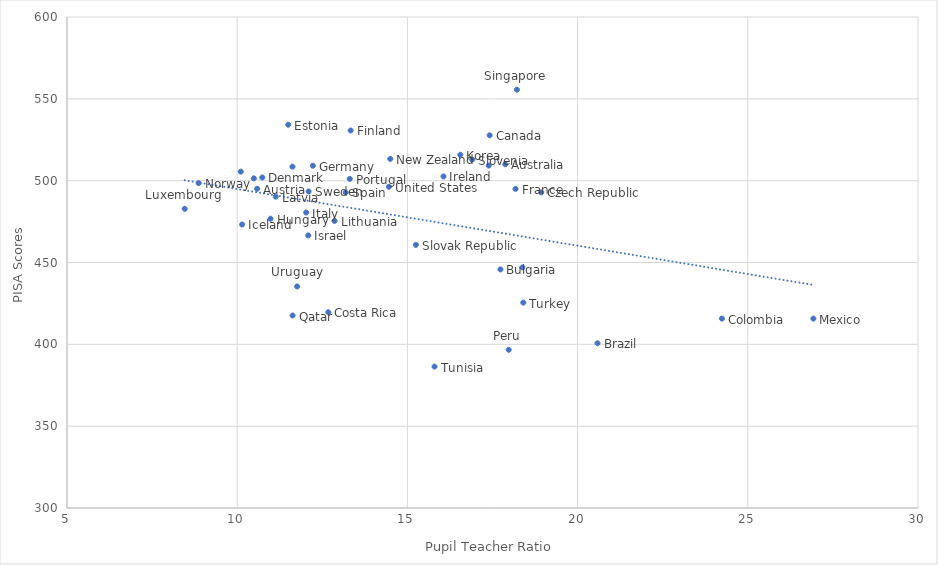
| Category | Series 0 |
|---|---|
| 17.87578 | 509.994 |
| 10.58415 | 495.037 |
| 20.58529 | 400.682 |
| 17.73363 | 445.772 |
| 17.41596 | 527.705 |
| 18.3778 | 446.956 |
| 24.23937 | 415.729 |
| 12.6763 | 419.608 |
| 18.93175 | 492.83 |
| 10.73738 | 501.937 |
| 11.49954 | 534.194 |
| 13.33204 | 530.661 |
| 18.1766 | 494.978 |
| 12.22305 | 509.141 |
| 10.97863 | 476.748 |
| 10.14405 | 473.23 |
| 16.06046 | 502.575 |
| 12.08838 | 466.553 |
| 12.02716 | 480.547 |
| 16.55424 | 515.81 |
| 11.13249 | 490.225 |
| 12.86014 | 475.409 |
| 8.45773 | 482.806 |
| 26.92701 | 415.71 |
| 11.62356 | 508.575 |
| 14.49628 | 513.304 |
| 8.86857 | 498.481 |
| 17.9767 | 396.684 |
| 10.49058 | 501.435 |
| 13.30619 | 501.1 |
| 11.62677 | 417.611 |
| 18.21792 | 555.575 |
| 15.24933 | 460.775 |
| 16.90462 | 512.864 |
| 13.18623 | 492.786 |
| 12.09754 | 493.422 |
| 10.10462 | 505.506 |
| 15.79669 | 386.403 |
| 18.40513 | 425.49 |
| 17.3882 | 509.222 |
| 14.45723 | 496.242 |
| 11.76053 | 435.363 |